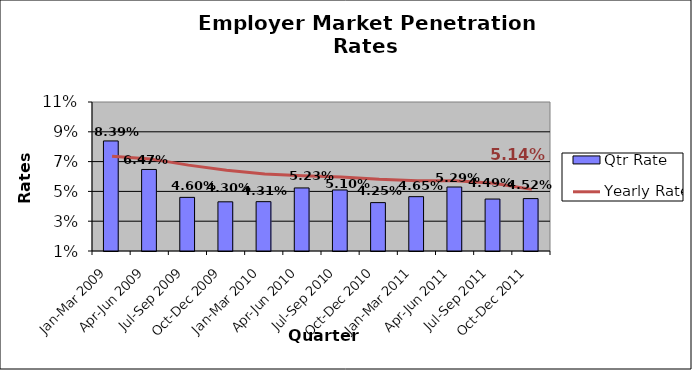
| Category | Qtr Rate |
|---|---|
| Jan-Mar 2009 | 0.084 |
| Apr-Jun 2009 | 0.065 |
| Jul-Sep 2009 | 0.046 |
| Oct-Dec 2009 | 0.043 |
| Jan-Mar 2010 | 0.043 |
| Apr-Jun 2010 | 0.052 |
| Jul-Sep 2010 | 0.051 |
| Oct-Dec 2010 | 0.042 |
| Jan-Mar 2011 | 0.046 |
| Apr-Jun 2011 | 0.053 |
| Jul-Sep 2011 | 0.045 |
| Oct-Dec 2011 | 0.045 |